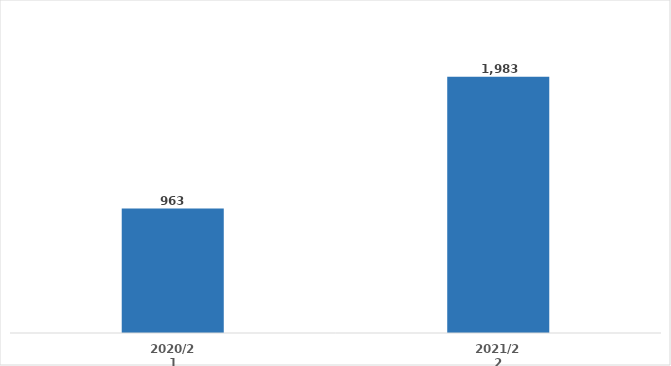
| Category | Series 0 |
|---|---|
| 2020/21 | 963.01 |
| 2021/22 | 1983 |